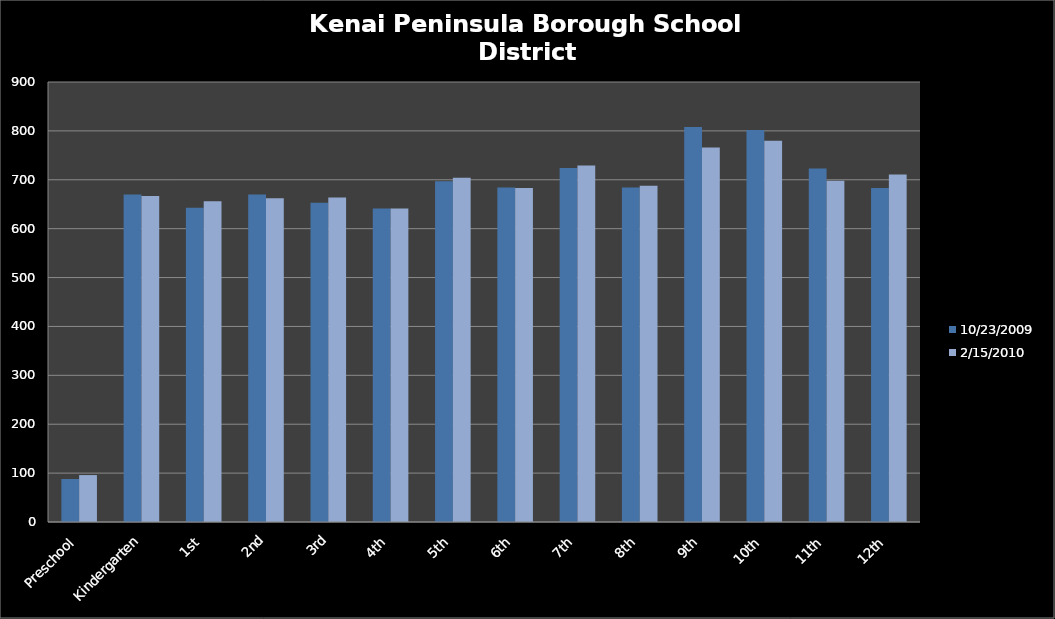
| Category | 10/23/2009 | 2/15/2010 |
|---|---|---|
| Preschool | 88 | 96 |
| Kindergarten | 670 | 667 |
| 1st | 643 | 656 |
| 2nd | 670 | 662 |
| 3rd | 653 | 664 |
| 4th | 641 | 641 |
| 5th | 697 | 704 |
| 6th | 684 | 683 |
| 7th | 724 | 729 |
| 8th | 684 | 688 |
| 9th | 808 | 766 |
| 10th | 802 | 780 |
| 11th | 723 | 698 |
| 12th | 683 | 711 |